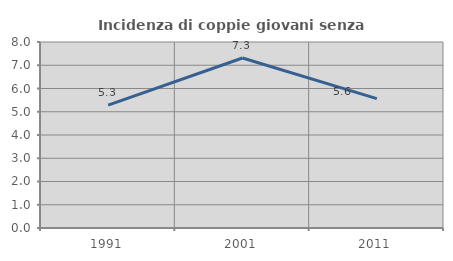
| Category | Incidenza di coppie giovani senza figli |
|---|---|
| 1991.0 | 5.282 |
| 2001.0 | 7.31 |
| 2011.0 | 5.567 |